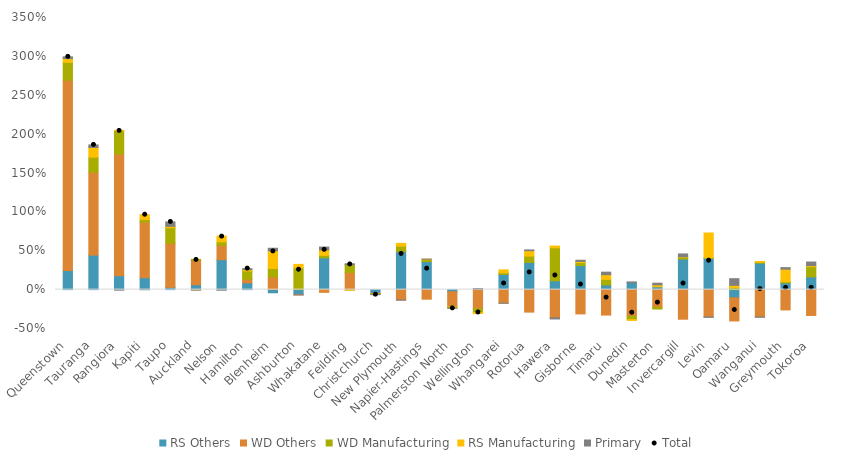
| Category | RS Others | WD Others | WD Manufacturing | RS Manufacturing | Primary |
|---|---|---|---|---|---|
| Queenstown | 0.245 | 2.447 | 0.23 | 0.049 | 0.022 |
| Tauranga | 0.443 | 1.067 | 0.193 | 0.124 | 0.033 |
| Rangiora | 0.178 | 1.567 | 0.3 | 0.004 | -0.007 |
| Kapiti | 0.153 | 0.715 | 0.033 | 0.061 | 0 |
| Taupo | 0.029 | 0.568 | 0.2 | 0.016 | 0.057 |
| Auckland | 0.063 | 0.318 | 0.008 | -0.003 | -0.003 |
| Nelson | 0.385 | 0.185 | 0.044 | 0.075 | -0.007 |
| Hamilton | 0.087 | 0.048 | 0.105 | 0.017 | 0.014 |
| Blenheim | -0.04 | 0.164 | 0.108 | 0.228 | 0.031 |
| Ashburton | -0.062 | -0.005 | 0.28 | 0.045 | -0.001 |
| Whakatane | 0.408 | -0.035 | 0.032 | 0.071 | 0.035 |
| Feilding | -0.004 | 0.222 | 0.099 | -0.004 | 0.011 |
| Christchurch | -0.046 | -0.007 | -0.008 | -0.001 | -0.002 |
| New Plymouth | 0.489 | -0.133 | 0.07 | 0.036 | -0.003 |
| Napier-Hastings | 0.361 | -0.123 | 0.025 | 0.005 | 0.002 |
| Palmerston North | -0.028 | -0.189 | -0.007 | -0.012 | -0.005 |
| Wellington | 0.003 | -0.248 | -0.046 | -0.014 | 0.011 |
| Whangarei | 0.195 | -0.173 | 0.023 | 0.037 | -0.002 |
| Rotorua | 0.35 | -0.289 | 0.081 | 0.069 | 0.01 |
| Hawera | 0.113 | -0.363 | 0.424 | 0.022 | -0.015 |
| Gisborne | 0.309 | -0.312 | 0.038 | 0.015 | 0.015 |
| Timaru | 0.059 | -0.328 | 0.073 | 0.06 | 0.032 |
| Dunedin | 0.089 | -0.343 | -0.042 | -0.011 | 0.01 |
| Masterton | 0.037 | -0.23 | -0.02 | 0.025 | 0.022 |
| Invercargill | 0.393 | -0.381 | 0.025 | 0.005 | 0.036 |
| Levin | 0.403 | -0.351 | 0.006 | 0.319 | -0.005 |
| Oamaru | -0.105 | -0.298 | 0.027 | 0.028 | 0.086 |
| Wanganui | 0.34 | -0.351 | 0.011 | 0.011 | -0.004 |
| Greymouth | 0.086 | -0.261 | 0.016 | 0.162 | 0.019 |
| Tokoroa | 0.163 | -0.332 | 0.132 | 0.013 | 0.046 |